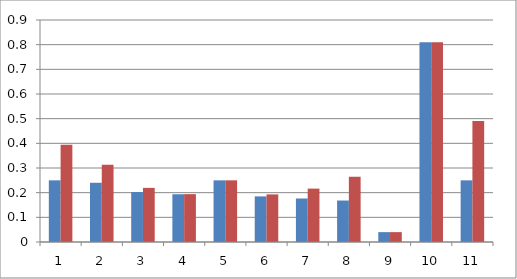
| Category | Series 0 | Series 1 |
|---|---|---|
| 0 | 0.25 | 0.394 |
| 1 | 0.24 | 0.313 |
| 2 | 0.202 | 0.219 |
| 3 | 0.194 | 0.194 |
| 4 | 0.25 | 0.25 |
| 5 | 0.185 | 0.193 |
| 6 | 0.176 | 0.216 |
| 7 | 0.168 | 0.264 |
| 8 | 0.04 | 0.04 |
| 9 | 0.81 | 0.81 |
| 10 | 0.25 | 0.49 |